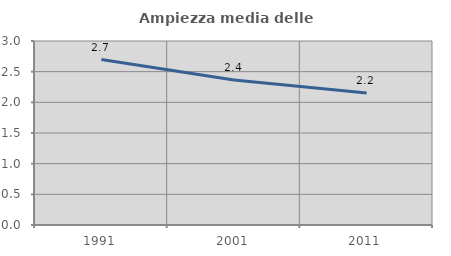
| Category | Ampiezza media delle famiglie |
|---|---|
| 1991.0 | 2.697 |
| 2001.0 | 2.365 |
| 2011.0 | 2.153 |